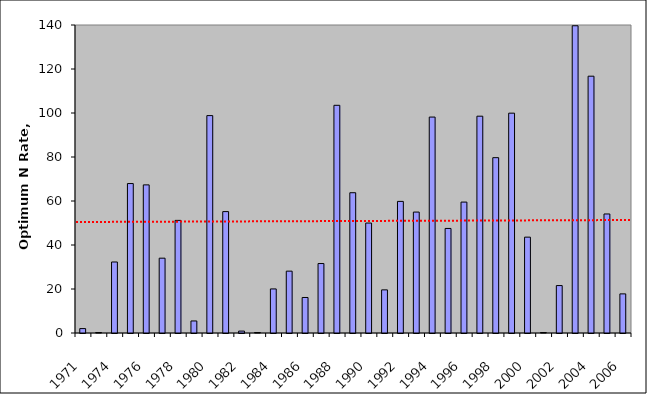
| Category | N Requirement |
|---|---|
| 1971.0 | 2.008 |
| 1972.0 | -17.523 |
| 1974.0 | 32.274 |
| 1975.0 | 67.931 |
| 1976.0 | 67.323 |
| 1977.0 | 34.009 |
| 1978.0 | 51.187 |
| 1979.0 | 5.471 |
| 1980.0 | 98.817 |
| 1981.0 | 55.18 |
| 1982.0 | 0.868 |
| 1983.0 | -3.212 |
| 1984.0 | 20.033 |
| 1985.0 | 28.114 |
| 1986.0 | 16.14 |
| 1987.0 | 31.577 |
| 1988.0 | 103.499 |
| 1989.0 | 63.763 |
| 1990.0 | 49.975 |
| 1991.0 | 19.603 |
| 1992.0 | 59.819 |
| 1993.0 | 54.969 |
| 1994.0 | 98.148 |
| 1995.0 | 47.523 |
| 1996.0 | 59.509 |
| 1997.0 | 98.544 |
| 1998.0 | 79.696 |
| 1999.0 | 99.929 |
| 2000.0 | 43.566 |
| 2001.0 | -18.234 |
| 2002.0 | 21.559 |
| 2003.0 | 139.658 |
| 2004.0 | 116.728 |
| 2005.0 | 54.098 |
| 2006.0 | 17.782 |